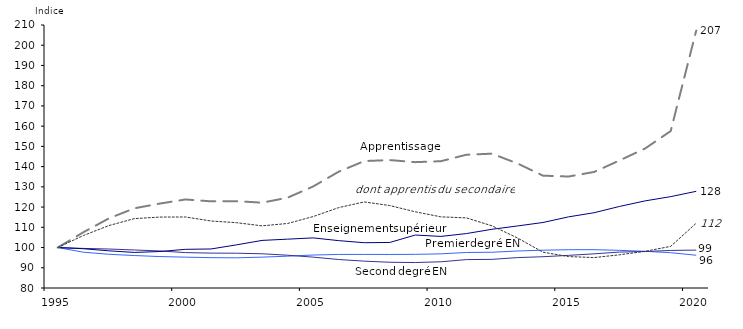
| Category | Premier degré EN | Second degré EN | Enseignement supérieur | Apprentissage | dont apprentis du secondaire |
|---|---|---|---|---|---|
| 1995.0 | 100 | 100 | 100 | 100 | 100 |
| 1996.0 | 97.701 | 99.565 | 99.411 | 107.538 | 105.937 |
| 1997.0 | 96.674 | 99.276 | 98.374 | 114.392 | 110.856 |
| 1998.0 | 96.047 | 98.786 | 97.583 | 119.404 | 114.296 |
| 1999.0 | 95.538 | 98.305 | 98.032 | 121.731 | 115.057 |
| 2000.0 | 95.251 | 97.494 | 99.12 | 123.765 | 115.106 |
| 2001.0 | 95.003 | 97.242 | 99.287 | 122.844 | 113.126 |
| 2002.0 | 94.919 | 97.198 | 101.33 | 122.933 | 112.282 |
| 2003.0 | 95.25 | 96.914 | 103.52 | 122.173 | 110.72 |
| 2004.0 | 95.737 | 96.207 | 104.146 | 124.654 | 111.891 |
| 2005.0 | 96.306 | 95.254 | 104.764 | 130.189 | 115.302 |
| 2006.0 | 96.59 | 94.083 | 103.414 | 137.485 | 119.735 |
| 2007.0 | 96.604 | 93.273 | 102.389 | 142.739 | 122.553 |
| 2008.0 | 96.582 | 92.724 | 102.511 | 143.24 | 120.754 |
| 2009.0 | 96.633 | 92.585 | 106.18 | 142.205 | 117.659 |
| 2010.0 | 96.883 | 92.958 | 105.497 | 142.678 | 115.175 |
| 2011.0 | 97.558 | 94.041 | 106.905 | 145.88 | 114.653 |
| 2012.0 | 97.677 | 94.152 | 109.02 | 146.393 | 110.748 |
| 2013.0 | 98.284 | 95.034 | 110.669 | 141.557 | 104.736 |
| 2014.0 | 98.69 | 95.457 | 112.377 | 135.533 | 97.702 |
| 2015.0 | 98.932 | 96.139 | 115.158 | 135.103 | 95.539 |
| 2016.0 | 98.949 | 96.885 | 117.209 | 137.359 | 95.034 |
| 2017.0 | 98.613 | 97.76 | 120.325 | 143.07 | 96.42 |
| 2018.0 | 98.133 | 98.025 | 123.058 | 148.973 | 98.148 |
| 2019.0 | 97.457 | 98.571 | 125.16 | 157.58 | 100.574 |
| 2020.0 | 96.193 | 98.734 | 127.785 | 207.22 | 112.04 |